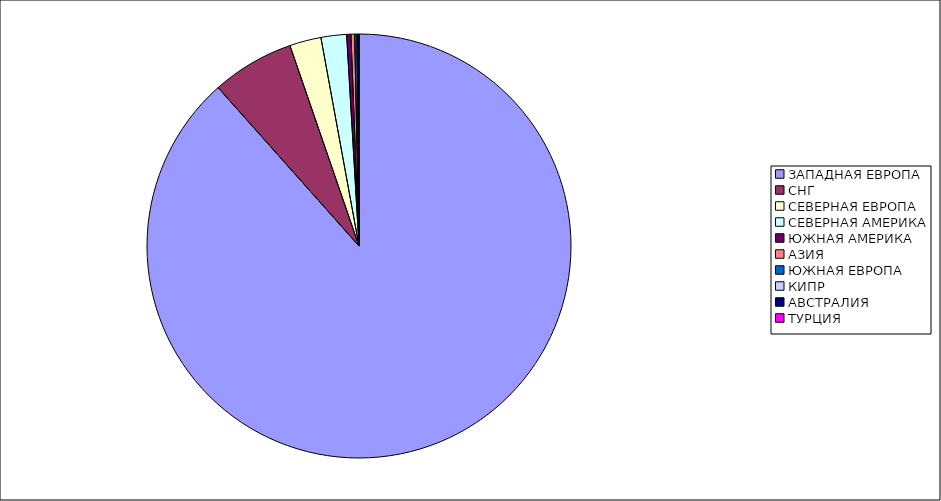
| Category | Оборот |
|---|---|
| ЗАПАДНАЯ ЕВРОПА | 0.884 |
| СНГ | 0.063 |
| СЕВЕРНАЯ ЕВРОПА | 0.024 |
| СЕВЕРНАЯ АМЕРИКА | 0.019 |
| ЮЖНАЯ АМЕРИКА | 0.003 |
| АЗИЯ | 0.003 |
| ЮЖНАЯ ЕВРОПА | 0.002 |
| КИПР | 0.001 |
| АВСТРАЛИЯ | 0.001 |
| ТУРЦИЯ | 0 |